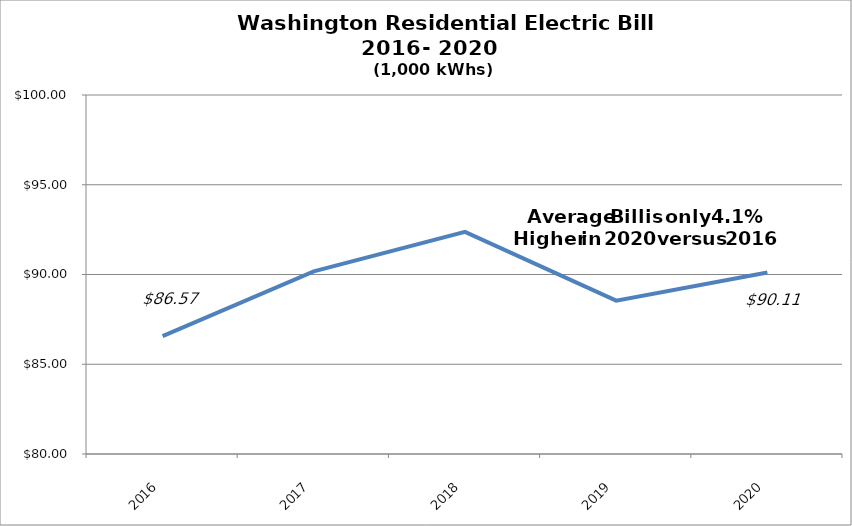
| Category | Washington Residential Electric Bill (1,000 kWhs) |
|---|---|
| 2016.0 | 86.566 |
| 2017.0 | 90.176 |
| 2018.0 | 92.376 |
| 2019.0 | 88.544 |
| 2020.0 | 90.108 |